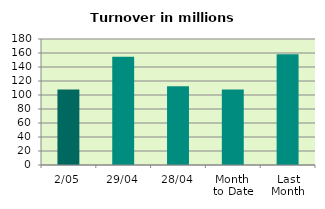
| Category | Series 0 |
|---|---|
| 2/05 | 107.894 |
| 29/04 | 154.586 |
| 28/04 | 112.53 |
| Month 
to Date | 107.894 |
| Last
Month | 158.303 |